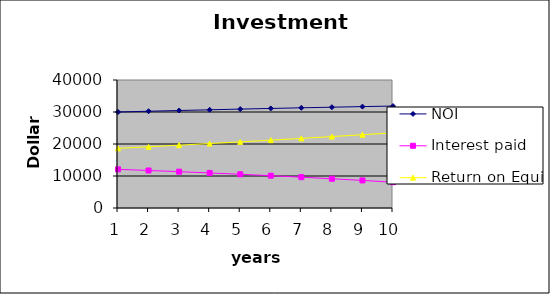
| Category | NOI | Interest paid | Return on Equity |
|---|---|---|---|
| 0 | 30000 | 12080.611 | 18640.324 |
| 1 | 30235.8 | 11726.032 | 19129.819 |
| 2 | 30465.39 | 11351.452 | 19630.361 |
| 3 | 30688.318 | 10955.743 | 20142.481 |
| 4 | 30904.113 | 10537.713 | 20666.743 |
| 5 | 31112.285 | 10096.103 | 21203.751 |
| 6 | 31312.323 | 9629.583 | 21754.146 |
| 7 | 31503.696 | 9136.747 | 22318.613 |
| 8 | 31685.85 | 8616.111 | 22897.881 |
| 9 | 31858.209 | 8066.107 | 23492.727 |